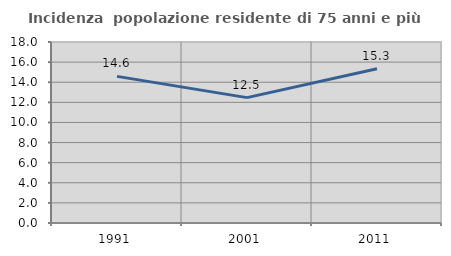
| Category | Incidenza  popolazione residente di 75 anni e più |
|---|---|
| 1991.0 | 14.583 |
| 2001.0 | 12.467 |
| 2011.0 | 15.331 |